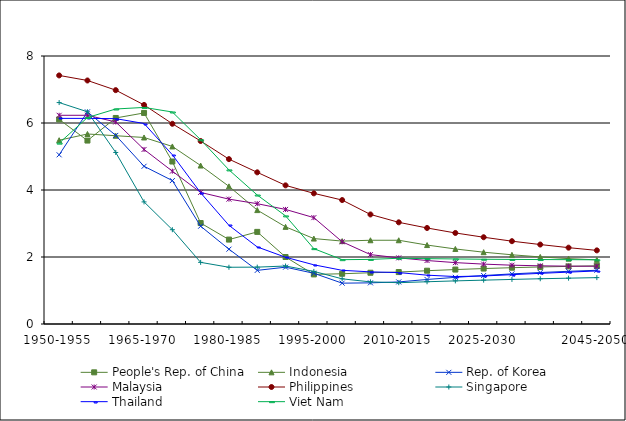
| Category | People's Rep. of China | Indonesia | Rep. of Korea | Malaysia | Philippines | Singapore | Thailand | Viet Nam |
|---|---|---|---|---|---|---|---|---|
| 1950-1955 | 6.107 | 5.486 | 5.05 | 6.23 | 7.42 | 6.61 | 6.138 | 5.399 |
|  | 5.476 | 5.672 | 6.332 | 6.23 | 7.269 | 6.335 | 6.138 | 6.164 |
|  | 6.15 | 5.62 | 5.63 | 6.03 | 6.981 | 5.12 | 6.13 | 6.418 |
| 1965-1970 | 6.3 | 5.568 | 4.708 | 5.21 | 6.539 | 3.645 | 5.985 | 6.465 |
|  | 4.85 | 5.3 | 4.281 | 4.561 | 5.977 | 2.815 | 5.052 | 6.328 |
|  | 3.014 | 4.73 | 2.919 | 3.928 | 5.462 | 1.84 | 3.915 | 5.499 |
| 1980-1985 | 2.52 | 4.109 | 2.234 | 3.727 | 4.922 | 1.694 | 2.945 | 4.6 |
|  | 2.75 | 3.4 | 1.601 | 3.591 | 4.527 | 1.697 | 2.3 | 3.85 |
|  | 2 | 2.9 | 1.696 | 3.42 | 4.138 | 1.731 | 1.992 | 3.227 |
| 1995-2000 | 1.48 | 2.55 | 1.514 | 3.175 | 3.9 | 1.57 | 1.767 | 2.249 |
|  | 1.5 | 2.475 | 1.219 | 2.454 | 3.7 | 1.348 | 1.603 | 1.921 |
|  | 1.53 | 2.5 | 1.228 | 2.071 | 3.27 | 1.257 | 1.556 | 1.928 |
| 2010-2015 | 1.55 | 2.5 | 1.256 | 1.974 | 3.035 | 1.233 | 1.535 | 1.962 |
|  | 1.591 | 2.357 | 1.329 | 1.895 | 2.867 | 1.261 | 1.458 | 1.951 |
|  | 1.625 | 2.24 | 1.392 | 1.832 | 2.718 | 1.287 | 1.416 | 1.942 |
| 2025-2030 | 1.655 | 2.144 | 1.447 | 1.788 | 2.59 | 1.309 | 1.433 | 1.933 |
|  | 1.681 | 2.066 | 1.496 | 1.755 | 2.472 | 1.33 | 1.473 | 1.927 |
|  | 1.703 | 2.002 | 1.537 | 1.737 | 2.372 | 1.351 | 1.511 | 1.924 |
|  | 1.72 | 1.951 | 1.573 | 1.727 | 2.279 | 1.368 | 1.548 | 1.921 |
| 2045-2050 | 1.736 | 1.914 | 1.604 | 1.724 | 2.198 | 1.384 | 1.583 | 1.917 |